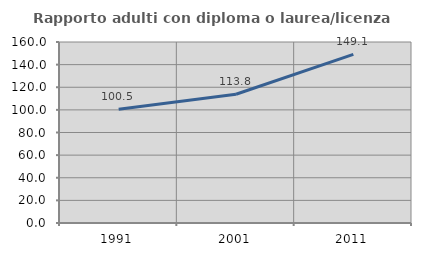
| Category | Rapporto adulti con diploma o laurea/licenza media  |
|---|---|
| 1991.0 | 100.508 |
| 2001.0 | 113.811 |
| 2011.0 | 149.112 |